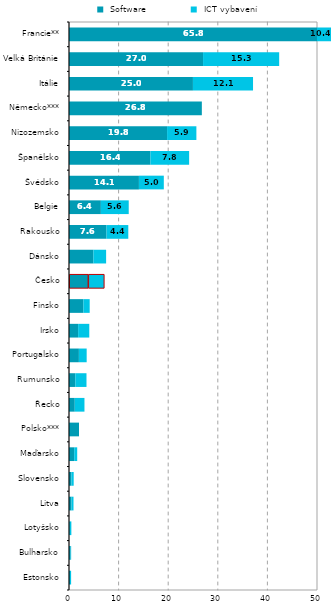
| Category |  Software |  ICT vybavení |
|---|---|---|
| Estonsko | 0.202 | 0.222 |
| Bulharsko | 0.324 | 0.109 |
| Lotyšsko | 0.166 | 0.308 |
| Litva | 0.505 | 0.402 |
| Slovensko | 0.491 | 0.454 |
| Maďarsko | 1.053 | 0.601 |
| Polsko*** | 2.022 | 0 |
| Řecko | 1.163 | 1.954 |
| Rumunsko | 1.278 | 2.248 |
| Portugalsko | 1.996 | 1.567 |
| Irsko | 1.84 | 2.249 |
| Finsko | 2.896 | 1.274 |
| Česko | 3.848 | 3.228 |
| Dánsko | 4.91 | 2.574 |
| Rakousko | 7.568 | 4.385 |
| Belgie | 6.426 | 5.616 |
| Švédsko | 14.099 | 5.016 |
| Španělsko | 16.416 | 7.803 |
| Nizozemsko | 19.774 | 5.908 |
| Německo*** | 26.782 | 0 |
| Itálie | 24.988 | 12.115 |
| Velká Británie | 27.028 | 15.345 |
| Francie** | 65.783 | 10.396 |